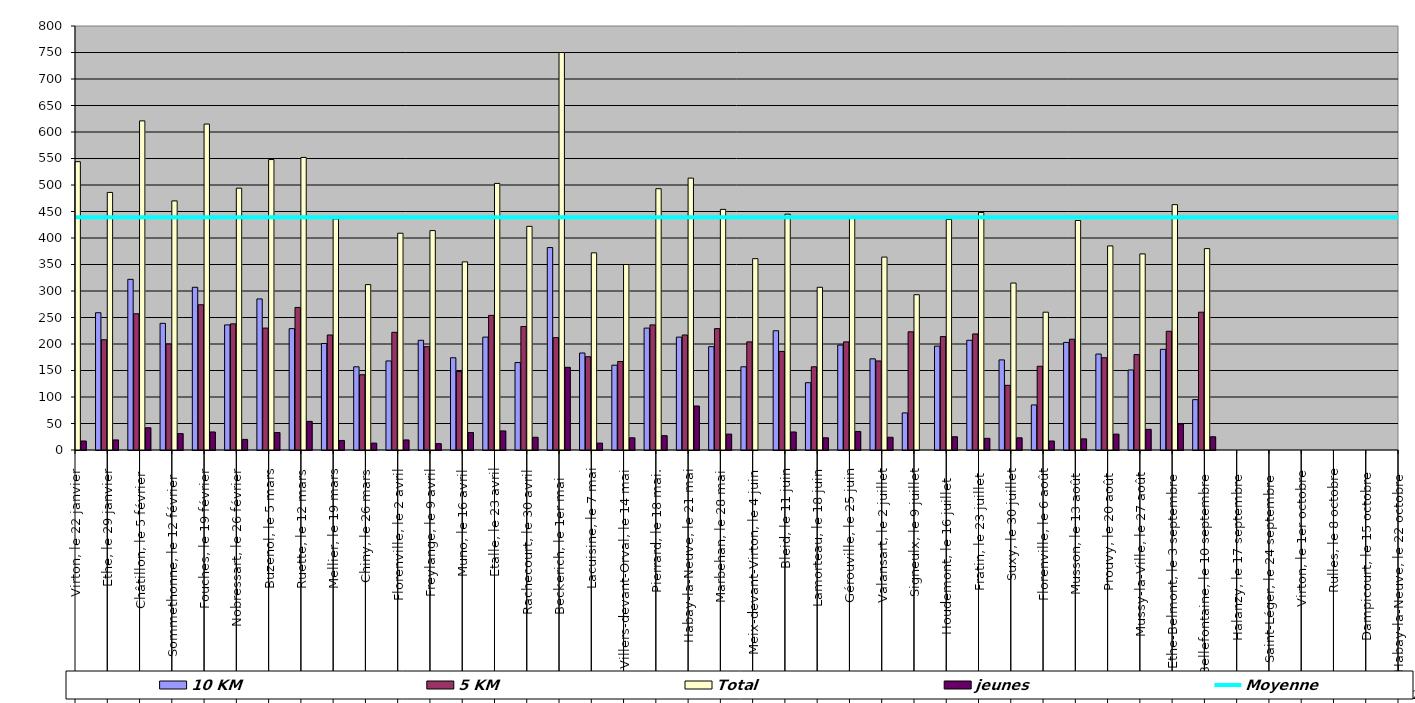
| Category | 10 KM | 5 KM | Total | jeunes |
|---|---|---|---|---|
| 0 | 296 | 231 | 544 | 17 |
| 1 | 259 | 208 | 486 | 19 |
| 2 | 322 | 257 | 621 | 42 |
| 3 | 239 | 200 | 470 | 31 |
| 4 | 307 | 274 | 615 | 34 |
| 5 | 236 | 238 | 494 | 20 |
| 6 | 285 | 230 | 548 | 33 |
| 7 | 229 | 269 | 552 | 54 |
| 8 | 201 | 217 | 436 | 18 |
| 9 | 157 | 142 | 312 | 13 |
| 10 | 168 | 222 | 409 | 19 |
| 11 | 207 | 195 | 414 | 12 |
| 12 | 174 | 148 | 355 | 33 |
| 13 | 213 | 254 | 503 | 36 |
| 14 | 165 | 233 | 422 | 24 |
| 15 | 382 | 212 | 750 | 156 |
| 16 | 183 | 176 | 372 | 13 |
| 17 | 160 | 167 | 350 | 23 |
| 18 | 230 | 236 | 493 | 27 |
| 19 | 213 | 217 | 513 | 83 |
| 20 | 195 | 229 | 454 | 30 |
| 21 | 157 | 204 | 361 | 0 |
| 22 | 225 | 186 | 445 | 34 |
| 23 | 127 | 157 | 307 | 23 |
| 24 | 198 | 204 | 437 | 35 |
| 25 | 172 | 168 | 364 | 24 |
| 26 | 70 | 223 | 293 | 0 |
| 27 | 196 | 214 | 435 | 25 |
| 28 | 207 | 219 | 448 | 22 |
| 29 | 170 | 122 | 315 | 23 |
| 30 | 85 | 158 | 260 | 17 |
| 31 | 203 | 209 | 433 | 21 |
| 32 | 181 | 174 | 385 | 30 |
| 33 | 151 | 180 | 370 | 39 |
| 34 | 190 | 224 | 463 | 49 |
| 35 | 95 | 260 | 380 | 25 |
| 36 | 0 | 0 | 0 | 0 |
| 37 | 0 | 0 | 0 | 0 |
| 38 | 0 | 0 | 0 | 0 |
| 39 | 0 | 0 | 0 | 0 |
| 40 | 0 | 0 | 0 | 0 |
| 41 | 0 | 0 | 0 | 0 |